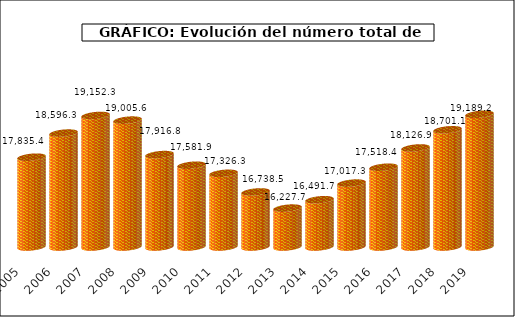
| Category | Series1 |
|---|---|
| 2005.0 | 17835.4 |
| 2006.0 | 18596.3 |
| 2007.0 | 19152.3 |
| 2008.0 | 19005.6 |
| 2009.0 | 17916.8 |
| 2010.0 | 17581.9 |
| 2011.0 | 17326.3 |
| 2012.0 | 16738.5 |
| 2013.0 | 16227.7 |
| 2014.0 | 16491.7 |
| 2015.0 | 17017.3 |
| 2016.0 | 17518.4 |
| 2017.0 | 18126.9 |
| 2018.0 | 18701.1 |
| 2019.0 | 19189.213 |